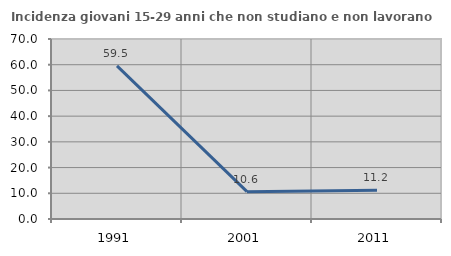
| Category | Incidenza giovani 15-29 anni che non studiano e non lavorano  |
|---|---|
| 1991.0 | 59.539 |
| 2001.0 | 10.638 |
| 2011.0 | 11.18 |